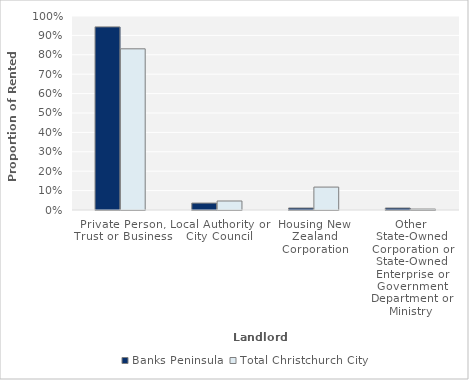
| Category | Banks Peninsula | Total Christchurch City |
|---|---|---|
| Private Person, Trust or Business | 0.944 | 0.831 |
| Local Authority or City Council | 0.036 | 0.046 |
| Housing New Zealand Corporation | 0.01 | 0.118 |
| Other State-Owned Corporation or State-Owned Enterprise or Government Department or Ministry | 0.01 | 0.005 |